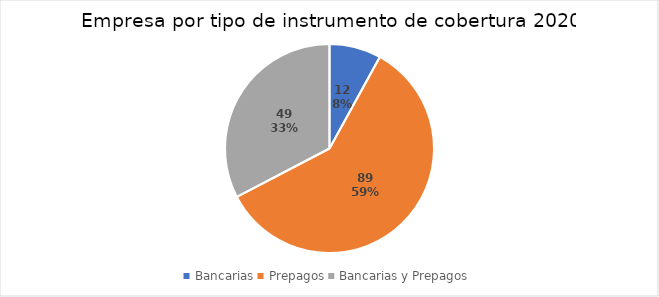
| Category | Series 0 |
|---|---|
| 0 | 12 |
| 1 | 89 |
| 2 | 49 |